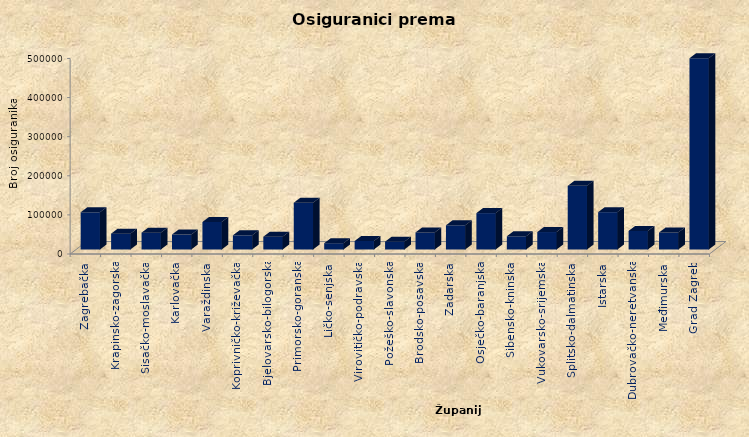
| Category | Series 0 |
|---|---|
| Zagrebačka | 95131 |
| Krapinsko-zagorska | 40491 |
| Sisačko-moslavačka | 43045 |
| Karlovačka | 38217 |
| Varaždinska | 70374 |
| Koprivničko-križevačka | 36262 |
| Bjelovarsko-bilogorska | 32696 |
| Primorsko-goranska | 119561 |
| Ličko-senjska | 16087 |
| Virovitičko-podravska | 21691 |
| Požeško-slavonska | 19993 |
| Brodsko-posavska | 43544 |
| Zadarska | 61921 |
| Osječko-baranjska | 93094 |
| Šibensko-kninska | 33766 |
| Vukovarsko-srijemska | 44648 |
| Splitsko-dalmatinska | 162752 |
| Istarska | 95561 |
| Dubrovačko-neretvanska | 47536 |
| Međimurska | 43481 |
| Grad Zagreb | 489026 |